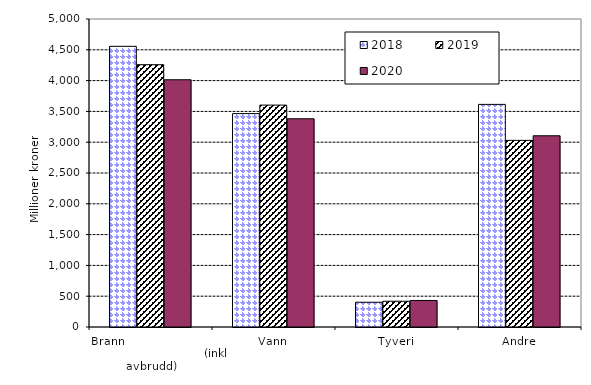
| Category | 2018 | 2019 | 2020 |
|---|---|---|---|
| Brann                                                       (inkl avbrudd) | 4556.418 | 4258.19 | 4013.568 |
| Vann | 3463.98 | 3602.199 | 3380.663 |
| Tyveri | 401.889 | 418.025 | 430.465 |
| Andre | 3613.977 | 3029.649 | 3104.204 |